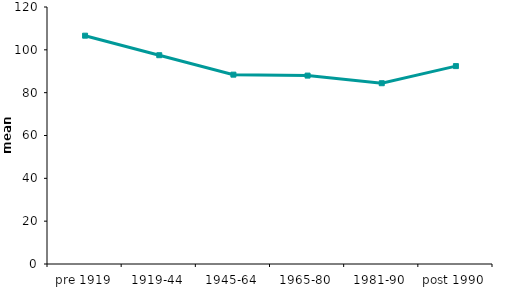
| Category | mean (m²) |
|---|---|
| pre 1919 | 106.606 |
| 1919-44 | 97.488 |
| 1945-64 | 88.41 |
| 1965-80 | 87.97 |
| 1981-90 | 84.405 |
| post 1990 | 92.402 |